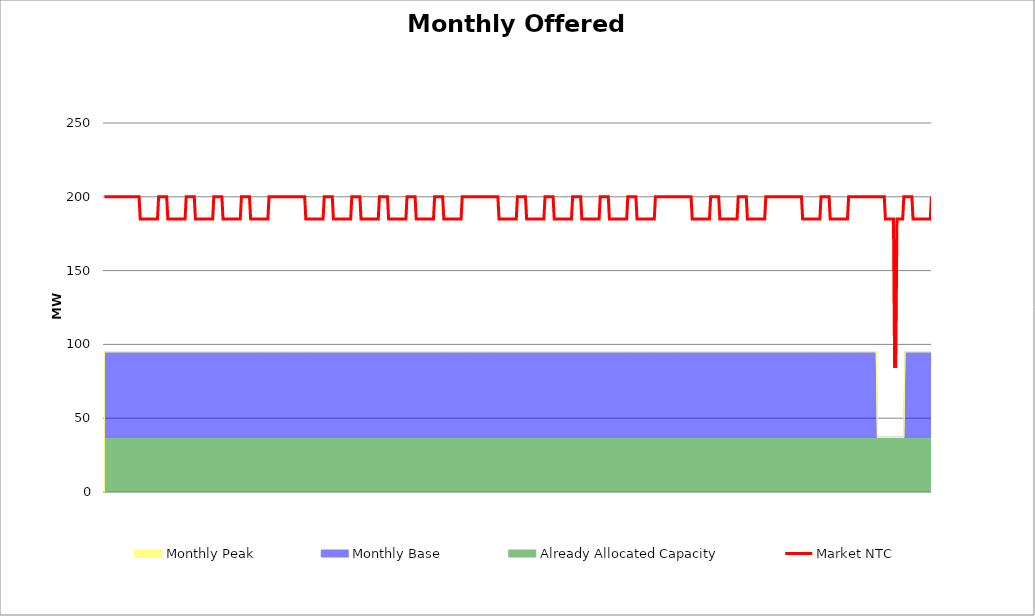
| Category | Market NTC |
|---|---|
| 0 | 200 |
| 1 | 200 |
| 2 | 200 |
| 3 | 200 |
| 4 | 200 |
| 5 | 200 |
| 6 | 200 |
| 7 | 200 |
| 8 | 200 |
| 9 | 200 |
| 10 | 200 |
| 11 | 200 |
| 12 | 200 |
| 13 | 200 |
| 14 | 200 |
| 15 | 200 |
| 16 | 200 |
| 17 | 200 |
| 18 | 200 |
| 19 | 200 |
| 20 | 200 |
| 21 | 200 |
| 22 | 200 |
| 23 | 200 |
| 24 | 200 |
| 25 | 200 |
| 26 | 200 |
| 27 | 200 |
| 28 | 200 |
| 29 | 200 |
| 30 | 200 |
| 31 | 185 |
| 32 | 185 |
| 33 | 185 |
| 34 | 185 |
| 35 | 185 |
| 36 | 185 |
| 37 | 185 |
| 38 | 185 |
| 39 | 185 |
| 40 | 185 |
| 41 | 185 |
| 42 | 185 |
| 43 | 185 |
| 44 | 185 |
| 45 | 185 |
| 46 | 185 |
| 47 | 200 |
| 48 | 200 |
| 49 | 200 |
| 50 | 200 |
| 51 | 200 |
| 52 | 200 |
| 53 | 200 |
| 54 | 200 |
| 55 | 185 |
| 56 | 185 |
| 57 | 185 |
| 58 | 185 |
| 59 | 185 |
| 60 | 185 |
| 61 | 185 |
| 62 | 185 |
| 63 | 185 |
| 64 | 185 |
| 65 | 185 |
| 66 | 185 |
| 67 | 185 |
| 68 | 185 |
| 69 | 185 |
| 70 | 185 |
| 71 | 200 |
| 72 | 200 |
| 73 | 200 |
| 74 | 200 |
| 75 | 200 |
| 76 | 200 |
| 77 | 200 |
| 78 | 200 |
| 79 | 185 |
| 80 | 185 |
| 81 | 185 |
| 82 | 185 |
| 83 | 185 |
| 84 | 185 |
| 85 | 185 |
| 86 | 185 |
| 87 | 185 |
| 88 | 185 |
| 89 | 185 |
| 90 | 185 |
| 91 | 185 |
| 92 | 185 |
| 93 | 185 |
| 94 | 185 |
| 95 | 200 |
| 96 | 200 |
| 97 | 200 |
| 98 | 200 |
| 99 | 200 |
| 100 | 200 |
| 101 | 200 |
| 102 | 200 |
| 103 | 185 |
| 104 | 185 |
| 105 | 185 |
| 106 | 185 |
| 107 | 185 |
| 108 | 185 |
| 109 | 185 |
| 110 | 185 |
| 111 | 185 |
| 112 | 185 |
| 113 | 185 |
| 114 | 185 |
| 115 | 185 |
| 116 | 185 |
| 117 | 185 |
| 118 | 185 |
| 119 | 200 |
| 120 | 200 |
| 121 | 200 |
| 122 | 200 |
| 123 | 200 |
| 124 | 200 |
| 125 | 200 |
| 126 | 200 |
| 127 | 185 |
| 128 | 185 |
| 129 | 185 |
| 130 | 185 |
| 131 | 185 |
| 132 | 185 |
| 133 | 185 |
| 134 | 185 |
| 135 | 185 |
| 136 | 185 |
| 137 | 185 |
| 138 | 185 |
| 139 | 185 |
| 140 | 185 |
| 141 | 185 |
| 142 | 185 |
| 143 | 200 |
| 144 | 200 |
| 145 | 200 |
| 146 | 200 |
| 147 | 200 |
| 148 | 200 |
| 149 | 200 |
| 150 | 200 |
| 151 | 200 |
| 152 | 200 |
| 153 | 200 |
| 154 | 200 |
| 155 | 200 |
| 156 | 200 |
| 157 | 200 |
| 158 | 200 |
| 159 | 200 |
| 160 | 200 |
| 161 | 200 |
| 162 | 200 |
| 163 | 200 |
| 164 | 200 |
| 165 | 200 |
| 166 | 200 |
| 167 | 200 |
| 168 | 200 |
| 169 | 200 |
| 170 | 200 |
| 171 | 200 |
| 172 | 200 |
| 173 | 200 |
| 174 | 200 |
| 175 | 185 |
| 176 | 185 |
| 177 | 185 |
| 178 | 185 |
| 179 | 185 |
| 180 | 185 |
| 181 | 185 |
| 182 | 185 |
| 183 | 185 |
| 184 | 185 |
| 185 | 185 |
| 186 | 185 |
| 187 | 185 |
| 188 | 185 |
| 189 | 185 |
| 190 | 185 |
| 191 | 200 |
| 192 | 200 |
| 193 | 200 |
| 194 | 200 |
| 195 | 200 |
| 196 | 200 |
| 197 | 200 |
| 198 | 200 |
| 199 | 185 |
| 200 | 185 |
| 201 | 185 |
| 202 | 185 |
| 203 | 185 |
| 204 | 185 |
| 205 | 185 |
| 206 | 185 |
| 207 | 185 |
| 208 | 185 |
| 209 | 185 |
| 210 | 185 |
| 211 | 185 |
| 212 | 185 |
| 213 | 185 |
| 214 | 185 |
| 215 | 200 |
| 216 | 200 |
| 217 | 200 |
| 218 | 200 |
| 219 | 200 |
| 220 | 200 |
| 221 | 200 |
| 222 | 200 |
| 223 | 185 |
| 224 | 185 |
| 225 | 185 |
| 226 | 185 |
| 227 | 185 |
| 228 | 185 |
| 229 | 185 |
| 230 | 185 |
| 231 | 185 |
| 232 | 185 |
| 233 | 185 |
| 234 | 185 |
| 235 | 185 |
| 236 | 185 |
| 237 | 185 |
| 238 | 185 |
| 239 | 200 |
| 240 | 200 |
| 241 | 200 |
| 242 | 200 |
| 243 | 200 |
| 244 | 200 |
| 245 | 200 |
| 246 | 200 |
| 247 | 185 |
| 248 | 185 |
| 249 | 185 |
| 250 | 185 |
| 251 | 185 |
| 252 | 185 |
| 253 | 185 |
| 254 | 185 |
| 255 | 185 |
| 256 | 185 |
| 257 | 185 |
| 258 | 185 |
| 259 | 185 |
| 260 | 185 |
| 261 | 185 |
| 262 | 185 |
| 263 | 200 |
| 264 | 200 |
| 265 | 200 |
| 266 | 200 |
| 267 | 200 |
| 268 | 200 |
| 269 | 200 |
| 270 | 200 |
| 271 | 185 |
| 272 | 185 |
| 273 | 185 |
| 274 | 185 |
| 275 | 185 |
| 276 | 185 |
| 277 | 185 |
| 278 | 185 |
| 279 | 185 |
| 280 | 185 |
| 281 | 185 |
| 282 | 185 |
| 283 | 185 |
| 284 | 185 |
| 285 | 185 |
| 286 | 185 |
| 287 | 200 |
| 288 | 200 |
| 289 | 200 |
| 290 | 200 |
| 291 | 200 |
| 292 | 200 |
| 293 | 200 |
| 294 | 200 |
| 295 | 185 |
| 296 | 185 |
| 297 | 185 |
| 298 | 185 |
| 299 | 185 |
| 300 | 185 |
| 301 | 185 |
| 302 | 185 |
| 303 | 185 |
| 304 | 185 |
| 305 | 185 |
| 306 | 185 |
| 307 | 185 |
| 308 | 185 |
| 309 | 185 |
| 310 | 185 |
| 311 | 200 |
| 312 | 200 |
| 313 | 200 |
| 314 | 200 |
| 315 | 200 |
| 316 | 200 |
| 317 | 200 |
| 318 | 200 |
| 319 | 200 |
| 320 | 200 |
| 321 | 200 |
| 322 | 200 |
| 323 | 200 |
| 324 | 200 |
| 325 | 200 |
| 326 | 200 |
| 327 | 200 |
| 328 | 200 |
| 329 | 200 |
| 330 | 200 |
| 331 | 200 |
| 332 | 200 |
| 333 | 200 |
| 334 | 200 |
| 335 | 200 |
| 336 | 200 |
| 337 | 200 |
| 338 | 200 |
| 339 | 200 |
| 340 | 200 |
| 341 | 200 |
| 342 | 200 |
| 343 | 185 |
| 344 | 185 |
| 345 | 185 |
| 346 | 185 |
| 347 | 185 |
| 348 | 185 |
| 349 | 185 |
| 350 | 185 |
| 351 | 185 |
| 352 | 185 |
| 353 | 185 |
| 354 | 185 |
| 355 | 185 |
| 356 | 185 |
| 357 | 185 |
| 358 | 185 |
| 359 | 200 |
| 360 | 200 |
| 361 | 200 |
| 362 | 200 |
| 363 | 200 |
| 364 | 200 |
| 365 | 200 |
| 366 | 200 |
| 367 | 185 |
| 368 | 185 |
| 369 | 185 |
| 370 | 185 |
| 371 | 185 |
| 372 | 185 |
| 373 | 185 |
| 374 | 185 |
| 375 | 185 |
| 376 | 185 |
| 377 | 185 |
| 378 | 185 |
| 379 | 185 |
| 380 | 185 |
| 381 | 185 |
| 382 | 185 |
| 383 | 200 |
| 384 | 200 |
| 385 | 200 |
| 386 | 200 |
| 387 | 200 |
| 388 | 200 |
| 389 | 200 |
| 390 | 200 |
| 391 | 185 |
| 392 | 185 |
| 393 | 185 |
| 394 | 185 |
| 395 | 185 |
| 396 | 185 |
| 397 | 185 |
| 398 | 185 |
| 399 | 185 |
| 400 | 185 |
| 401 | 185 |
| 402 | 185 |
| 403 | 185 |
| 404 | 185 |
| 405 | 185 |
| 406 | 185 |
| 407 | 200 |
| 408 | 200 |
| 409 | 200 |
| 410 | 200 |
| 411 | 200 |
| 412 | 200 |
| 413 | 200 |
| 414 | 200 |
| 415 | 185 |
| 416 | 185 |
| 417 | 185 |
| 418 | 185 |
| 419 | 185 |
| 420 | 185 |
| 421 | 185 |
| 422 | 185 |
| 423 | 185 |
| 424 | 185 |
| 425 | 185 |
| 426 | 185 |
| 427 | 185 |
| 428 | 185 |
| 429 | 185 |
| 430 | 185 |
| 431 | 200 |
| 432 | 200 |
| 433 | 200 |
| 434 | 200 |
| 435 | 200 |
| 436 | 200 |
| 437 | 200 |
| 438 | 200 |
| 439 | 185 |
| 440 | 185 |
| 441 | 185 |
| 442 | 185 |
| 443 | 185 |
| 444 | 185 |
| 445 | 185 |
| 446 | 185 |
| 447 | 185 |
| 448 | 185 |
| 449 | 185 |
| 450 | 185 |
| 451 | 185 |
| 452 | 185 |
| 453 | 185 |
| 454 | 185 |
| 455 | 200 |
| 456 | 200 |
| 457 | 200 |
| 458 | 200 |
| 459 | 200 |
| 460 | 200 |
| 461 | 200 |
| 462 | 200 |
| 463 | 185 |
| 464 | 185 |
| 465 | 185 |
| 466 | 185 |
| 467 | 185 |
| 468 | 185 |
| 469 | 185 |
| 470 | 185 |
| 471 | 185 |
| 472 | 185 |
| 473 | 185 |
| 474 | 185 |
| 475 | 185 |
| 476 | 185 |
| 477 | 185 |
| 478 | 185 |
| 479 | 200 |
| 480 | 200 |
| 481 | 200 |
| 482 | 200 |
| 483 | 200 |
| 484 | 200 |
| 485 | 200 |
| 486 | 200 |
| 487 | 200 |
| 488 | 200 |
| 489 | 200 |
| 490 | 200 |
| 491 | 200 |
| 492 | 200 |
| 493 | 200 |
| 494 | 200 |
| 495 | 200 |
| 496 | 200 |
| 497 | 200 |
| 498 | 200 |
| 499 | 200 |
| 500 | 200 |
| 501 | 200 |
| 502 | 200 |
| 503 | 200 |
| 504 | 200 |
| 505 | 200 |
| 506 | 200 |
| 507 | 200 |
| 508 | 200 |
| 509 | 200 |
| 510 | 200 |
| 511 | 185 |
| 512 | 185 |
| 513 | 185 |
| 514 | 185 |
| 515 | 185 |
| 516 | 185 |
| 517 | 185 |
| 518 | 185 |
| 519 | 185 |
| 520 | 185 |
| 521 | 185 |
| 522 | 185 |
| 523 | 185 |
| 524 | 185 |
| 525 | 185 |
| 526 | 185 |
| 527 | 200 |
| 528 | 200 |
| 529 | 200 |
| 530 | 200 |
| 531 | 200 |
| 532 | 200 |
| 533 | 200 |
| 534 | 200 |
| 535 | 185 |
| 536 | 185 |
| 537 | 185 |
| 538 | 185 |
| 539 | 185 |
| 540 | 185 |
| 541 | 185 |
| 542 | 185 |
| 543 | 185 |
| 544 | 185 |
| 545 | 185 |
| 546 | 185 |
| 547 | 185 |
| 548 | 185 |
| 549 | 185 |
| 550 | 185 |
| 551 | 200 |
| 552 | 200 |
| 553 | 200 |
| 554 | 200 |
| 555 | 200 |
| 556 | 200 |
| 557 | 200 |
| 558 | 200 |
| 559 | 185 |
| 560 | 185 |
| 561 | 185 |
| 562 | 185 |
| 563 | 185 |
| 564 | 185 |
| 565 | 185 |
| 566 | 185 |
| 567 | 185 |
| 568 | 185 |
| 569 | 185 |
| 570 | 185 |
| 571 | 185 |
| 572 | 185 |
| 573 | 185 |
| 574 | 185 |
| 575 | 200 |
| 576 | 200 |
| 577 | 200 |
| 578 | 200 |
| 579 | 200 |
| 580 | 200 |
| 581 | 200 |
| 582 | 200 |
| 583 | 200 |
| 584 | 200 |
| 585 | 200 |
| 586 | 200 |
| 587 | 200 |
| 588 | 200 |
| 589 | 200 |
| 590 | 200 |
| 591 | 200 |
| 592 | 200 |
| 593 | 200 |
| 594 | 200 |
| 595 | 200 |
| 596 | 200 |
| 597 | 200 |
| 598 | 200 |
| 599 | 200 |
| 600 | 200 |
| 601 | 200 |
| 602 | 200 |
| 603 | 200 |
| 604 | 200 |
| 605 | 200 |
| 606 | 200 |
| 607 | 185 |
| 608 | 185 |
| 609 | 185 |
| 610 | 185 |
| 611 | 185 |
| 612 | 185 |
| 613 | 185 |
| 614 | 185 |
| 615 | 185 |
| 616 | 185 |
| 617 | 185 |
| 618 | 185 |
| 619 | 185 |
| 620 | 185 |
| 621 | 185 |
| 622 | 185 |
| 623 | 200 |
| 624 | 200 |
| 625 | 200 |
| 626 | 200 |
| 627 | 200 |
| 628 | 200 |
| 629 | 200 |
| 630 | 200 |
| 631 | 185 |
| 632 | 185 |
| 633 | 185 |
| 634 | 185 |
| 635 | 185 |
| 636 | 185 |
| 637 | 185 |
| 638 | 185 |
| 639 | 185 |
| 640 | 185 |
| 641 | 185 |
| 642 | 185 |
| 643 | 185 |
| 644 | 185 |
| 645 | 185 |
| 646 | 185 |
| 647 | 200 |
| 648 | 200 |
| 649 | 200 |
| 650 | 200 |
| 651 | 200 |
| 652 | 200 |
| 653 | 200 |
| 654 | 200 |
| 655 | 200 |
| 656 | 200 |
| 657 | 200 |
| 658 | 200 |
| 659 | 200 |
| 660 | 200 |
| 661 | 200 |
| 662 | 200 |
| 663 | 200 |
| 664 | 200 |
| 665 | 200 |
| 666 | 200 |
| 667 | 200 |
| 668 | 200 |
| 669 | 200 |
| 670 | 200 |
| 671 | 200 |
| 672 | 200 |
| 673 | 200 |
| 674 | 200 |
| 675 | 200 |
| 676 | 200 |
| 677 | 200 |
| 678 | 200 |
| 679 | 185 |
| 680 | 185 |
| 681 | 185 |
| 682 | 185 |
| 683 | 185 |
| 684 | 185 |
| 685 | 185 |
| 686 | 185 |
| 687 | 85 |
| 688 | 85 |
| 689 | 185 |
| 690 | 185 |
| 691 | 185 |
| 692 | 185 |
| 693 | 185 |
| 694 | 185 |
| 695 | 200 |
| 696 | 200 |
| 697 | 200 |
| 698 | 200 |
| 699 | 200 |
| 700 | 200 |
| 701 | 200 |
| 702 | 200 |
| 703 | 185 |
| 704 | 185 |
| 705 | 185 |
| 706 | 185 |
| 707 | 185 |
| 708 | 185 |
| 709 | 185 |
| 710 | 185 |
| 711 | 185 |
| 712 | 185 |
| 713 | 185 |
| 714 | 185 |
| 715 | 185 |
| 716 | 185 |
| 717 | 185 |
| 718 | 185 |
| 719 | 200 |